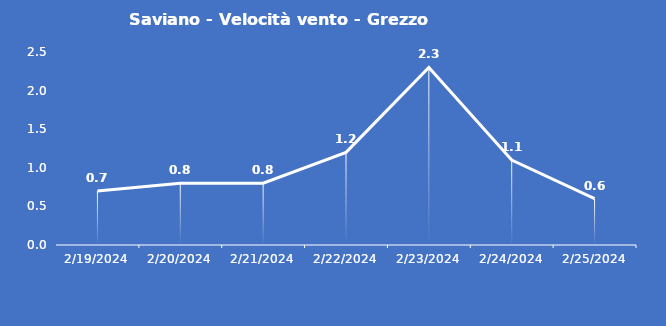
| Category | Saviano - Velocità vento - Grezzo (m/s) |
|---|---|
| 2/19/24 | 0.7 |
| 2/20/24 | 0.8 |
| 2/21/24 | 0.8 |
| 2/22/24 | 1.2 |
| 2/23/24 | 2.3 |
| 2/24/24 | 1.1 |
| 2/25/24 | 0.6 |